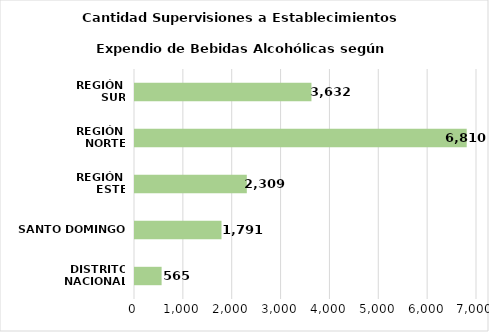
| Category | Series 0 |
|---|---|
| DISTRITO NACIONAL | 565 |
| SANTO DOMINGO | 1791 |
| REGIÓN 
ESTE | 2309 |
| REGIÓN 
NORTE | 6810 |
| REGIÓN 
SUR | 3632 |